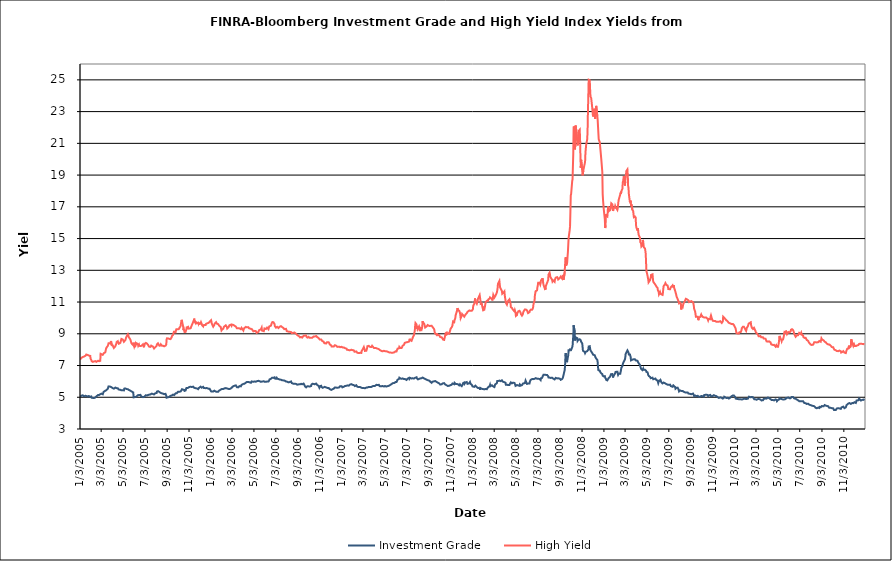
| Category | Investment Grade | High Yield |
|---|---|---|
| 1/3/05 | 5.028 | 7.369 |
| 1/4/05 | 5.061 | 7.382 |
| 1/5/05 | 5.074 | 7.452 |
| 1/6/05 | 5.093 | 7.439 |
| 1/7/05 | 5.104 | 7.456 |
| 1/10/05 | 5.126 | 7.538 |
| 1/11/05 | 5.11 | 7.556 |
| 1/12/05 | 5.098 | 7.546 |
| 1/13/05 | 5.059 | 7.556 |
| 1/14/05 | 5.074 | 7.594 |
| 1/18/05 | 5.096 | 7.617 |
| 1/19/05 | 5.083 | 7.6 |
| 1/20/05 | 5.094 | 7.692 |
| 1/21/05 | 5.073 | 7.68 |
| 1/24/05 | 5.045 | 7.664 |
| 1/25/05 | 5.062 | 7.654 |
| 1/26/05 | 5.059 | 7.637 |
| 1/27/05 | 5.078 | 7.626 |
| 1/28/05 | 5.033 | 7.615 |
| 1/31/05 | 5.028 | 7.608 |
| 2/1/05 | 5.034 | 7.427 |
| 2/2/05 | 5.038 | 7.385 |
| 2/3/05 | 5.049 | 7.352 |
| 2/4/05 | 4.972 | 7.275 |
| 2/7/05 | 4.959 | 7.23 |
| 2/8/05 | 4.946 | 7.196 |
| 2/9/05 | 4.923 | 7.215 |
| 2/10/05 | 4.948 | 7.251 |
| 2/11/05 | 4.984 | 7.29 |
| 2/14/05 | 4.982 | 7.278 |
| 2/15/05 | 4.994 | 7.24 |
| 2/16/05 | 5.031 | 7.237 |
| 2/17/05 | 5.053 | 7.232 |
| 2/18/05 | 5.105 | 7.274 |
| 2/22/05 | 5.144 | 7.302 |
| 2/23/05 | 5.127 | 7.284 |
| 2/24/05 | 5.133 | 7.273 |
| 2/25/05 | 5.145 | 7.273 |
| 2/28/05 | 5.191 | 7.296 |
| 3/1/05 | 5.227 | 7.737 |
| 3/2/05 | 5.236 | 7.751 |
| 3/3/05 | 5.229 | 7.721 |
| 3/4/05 | 5.21 | 7.702 |
| 3/7/05 | 5.186 | 7.672 |
| 3/8/05 | 5.24 | 7.648 |
| 3/9/05 | 5.331 | 7.723 |
| 3/10/05 | 5.354 | 7.781 |
| 3/11/05 | 5.376 | 7.785 |
| 3/14/05 | 5.41 | 7.828 |
| 3/15/05 | 5.408 | 7.878 |
| 3/16/05 | 5.456 | 8.046 |
| 3/17/05 | 5.447 | 8.114 |
| 3/18/05 | 5.477 | 8.084 |
| 3/21/05 | 5.533 | 8.24 |
| 3/22/05 | 5.584 | 8.309 |
| 3/23/05 | 5.683 | 8.4 |
| 3/24/05 | 5.626 | 8.362 |
| 3/28/05 | 5.67 | 8.395 |
| 3/29/05 | 5.673 | 8.451 |
| 3/30/05 | 5.664 | 8.544 |
| 3/31/05 | 5.634 | 8.558 |
| 4/1/05 | 5.578 | 8.28 |
| 4/4/05 | 5.574 | 8.27 |
| 4/5/05 | 5.574 | 8.2 |
| 4/6/05 | 5.544 | 8.139 |
| 4/7/05 | 5.544 | 8.108 |
| 4/8/05 | 5.588 | 8.132 |
| 4/11/05 | 5.612 | 8.213 |
| 4/12/05 | 5.571 | 8.236 |
| 4/13/05 | 5.554 | 8.248 |
| 4/14/05 | 5.576 | 8.393 |
| 4/15/05 | 5.586 | 8.486 |
| 4/18/05 | 5.564 | 8.535 |
| 4/19/05 | 5.514 | 8.464 |
| 4/20/05 | 5.494 | 8.418 |
| 4/21/05 | 5.485 | 8.374 |
| 4/22/05 | 5.468 | 8.392 |
| 4/25/05 | 5.469 | 8.43 |
| 4/26/05 | 5.487 | 8.505 |
| 4/27/05 | 5.463 | 8.593 |
| 4/28/05 | 5.436 | 8.676 |
| 4/29/05 | 5.436 | 8.722 |
| 5/2/05 | 5.446 | 8.635 |
| 5/3/05 | 5.441 | 8.618 |
| 5/4/05 | 5.435 | 8.583 |
| 5/5/05 | 5.433 | 8.497 |
| 5/6/05 | 5.547 | 8.559 |
| 5/9/05 | 5.558 | 8.604 |
| 5/10/05 | 5.532 | 8.681 |
| 5/11/05 | 5.515 | 8.757 |
| 5/12/05 | 5.52 | 8.8 |
| 5/13/05 | 5.508 | 8.853 |
| 5/16/05 | 5.508 | 8.966 |
| 5/17/05 | 5.511 | 9.027 |
| 5/18/05 | 5.463 | 8.921 |
| 5/19/05 | 5.456 | 8.776 |
| 5/20/05 | 5.458 | 8.729 |
| 5/23/05 | 5.414 | 8.634 |
| 5/24/05 | 5.401 | 8.618 |
| 5/25/05 | 5.379 | 8.478 |
| 5/26/05 | 5.372 | 8.401 |
| 5/27/05 | 5.349 | 8.36 |
| 5/31/05 | 5.301 | 8.283 |
| 6/1/05 | 4.996 | 8.441 |
| 6/2/05 | 4.948 | 8.3 |
| 6/3/05 | 4.961 | 8.195 |
| 6/6/05 | 5.019 | 8.372 |
| 6/7/05 | 4.971 | 8.293 |
| 6/8/05 | 4.994 | 8.334 |
| 6/9/05 | 5.048 | 8.402 |
| 6/10/05 | 5.078 | 8.425 |
| 6/13/05 | 5.128 | 8.354 |
| 6/14/05 | 5.144 | 8.244 |
| 6/15/05 | 5.15 | 8.181 |
| 6/16/05 | 5.144 | 8.323 |
| 6/17/05 | 5.118 | 8.241 |
| 6/20/05 | 5.15 | 8.229 |
| 6/21/05 | 5.113 | 8.257 |
| 6/22/05 | 5.054 | 8.269 |
| 6/23/05 | 5.055 | 8.242 |
| 6/24/05 | 5.029 | 8.268 |
| 6/27/05 | 5.006 | 8.33 |
| 6/28/05 | 5.031 | 8.263 |
| 6/29/05 | 5.039 | 8.218 |
| 6/30/05 | 5.022 | 8.15 |
| 7/1/05 | 5.04 | 8.341 |
| 7/5/05 | 5.13 | 8.426 |
| 7/6/05 | 5.118 | 8.428 |
| 7/7/05 | 5.081 | 8.459 |
| 7/8/05 | 5.109 | 8.388 |
| 7/11/05 | 5.14 | 8.313 |
| 7/12/05 | 5.145 | 8.28 |
| 7/13/05 | 5.168 | 8.276 |
| 7/14/05 | 5.16 | 8.191 |
| 7/15/05 | 5.169 | 8.186 |
| 7/18/05 | 5.18 | 8.177 |
| 7/19/05 | 5.192 | 8.206 |
| 7/20/05 | 5.195 | 8.254 |
| 7/21/05 | 5.227 | 8.224 |
| 7/22/05 | 5.208 | 8.194 |
| 7/25/05 | 5.207 | 8.19 |
| 7/26/05 | 5.216 | 8.179 |
| 7/27/05 | 5.219 | 8.13 |
| 7/28/05 | 5.177 | 8.07 |
| 7/29/05 | 5.207 | 8.069 |
| 8/1/05 | 5.259 | 8.162 |
| 8/2/05 | 5.266 | 8.164 |
| 8/3/05 | 5.266 | 8.222 |
| 8/4/05 | 5.263 | 8.234 |
| 8/5/05 | 5.355 | 8.327 |
| 8/8/05 | 5.383 | 8.398 |
| 8/9/05 | 5.395 | 8.37 |
| 8/10/05 | 5.365 | 8.317 |
| 8/11/05 | 5.349 | 8.326 |
| 8/12/05 | 5.296 | 8.249 |
| 8/15/05 | 5.282 | 8.262 |
| 8/16/05 | 5.252 | 8.332 |
| 8/17/05 | 5.268 | 8.314 |
| 8/18/05 | 5.252 | 8.296 |
| 8/19/05 | 5.247 | 8.249 |
| 8/22/05 | 5.231 | 8.243 |
| 8/23/05 | 5.211 | 8.222 |
| 8/24/05 | 5.211 | 8.209 |
| 8/25/05 | 5.194 | 8.208 |
| 8/26/05 | 5.21 | 8.195 |
| 8/29/05 | 5.215 | 8.25 |
| 8/30/05 | 5.192 | 8.268 |
| 8/31/05 | 5.105 | 8.317 |
| 9/1/05 | 4.973 | 8.637 |
| 9/2/05 | 4.97 | 8.712 |
| 9/6/05 | 5.006 | 8.707 |
| 9/7/05 | 5.052 | 8.712 |
| 9/8/05 | 5.064 | 8.731 |
| 9/9/05 | 5.042 | 8.676 |
| 9/12/05 | 5.089 | 8.664 |
| 9/13/05 | 5.056 | 8.712 |
| 9/14/05 | 5.067 | 8.719 |
| 9/15/05 | 5.106 | 8.778 |
| 9/16/05 | 5.165 | 8.855 |
| 9/19/05 | 5.167 | 8.932 |
| 9/20/05 | 5.19 | 9.028 |
| 9/21/05 | 5.136 | 9.092 |
| 9/22/05 | 5.136 | 9.181 |
| 9/23/05 | 5.177 | 9.094 |
| 9/26/05 | 5.246 | 9.09 |
| 9/27/05 | 5.26 | 9.191 |
| 9/28/05 | 5.248 | 9.278 |
| 9/29/05 | 5.248 | 9.253 |
| 9/30/05 | 5.286 | 9.23 |
| 10/3/05 | 5.347 | 9.279 |
| 10/4/05 | 5.339 | 9.245 |
| 10/5/05 | 5.326 | 9.278 |
| 10/6/05 | 5.344 | 9.32 |
| 10/7/05 | 5.364 | 9.392 |
| 10/10/05 | 5.363 | 9.476 |
| 10/11/05 | 5.386 | 9.648 |
| 10/12/05 | 5.43 | 9.768 |
| 10/13/05 | 5.492 | 9.877 |
| 10/14/05 | 5.509 | 9.795 |
| 10/17/05 | 5.479 | 9.459 |
| 10/18/05 | 5.456 | 9.226 |
| 10/19/05 | 5.446 | 9.298 |
| 10/20/05 | 5.466 | 9.271 |
| 10/21/05 | 5.402 | 9.111 |
| 10/24/05 | 5.43 | 9.119 |
| 10/25/05 | 5.485 | 9.142 |
| 10/26/05 | 5.578 | 9.281 |
| 10/27/05 | 5.586 | 9.406 |
| 10/28/05 | 5.588 | 9.441 |
| 10/31/05 | 5.593 | 9.437 |
| 11/1/05 | 5.581 | 9.325 |
| 11/2/05 | 5.614 | 9.326 |
| 11/3/05 | 5.646 | 9.278 |
| 11/4/05 | 5.663 | 9.328 |
| 11/7/05 | 5.665 | 9.351 |
| 11/8/05 | 5.604 | 9.392 |
| 11/9/05 | 5.656 | 9.469 |
| 11/10/05 | 5.643 | 9.492 |
| 11/11/05 | 5.622 | 9.436 |
| 11/14/05 | 5.671 | 9.741 |
| 11/15/05 | 5.652 | 9.76 |
| 11/16/05 | 5.61 | 9.857 |
| 11/17/05 | 5.593 | 9.956 |
| 11/18/05 | 5.6 | 9.759 |
| 11/21/05 | 5.571 | 9.665 |
| 11/22/05 | 5.562 | 9.733 |
| 11/23/05 | 5.564 | 9.738 |
| 11/25/05 | 5.552 | 9.674 |
| 11/28/05 | 5.512 | 9.702 |
| 11/29/05 | 5.547 | 9.63 |
| 11/30/05 | 5.584 | 9.697 |
| 12/1/05 | 5.613 | 9.578 |
| 12/2/05 | 5.634 | 9.648 |
| 12/5/05 | 5.671 | 9.662 |
| 12/6/05 | 5.641 | 9.727 |
| 12/7/05 | 5.647 | 9.687 |
| 12/8/05 | 5.604 | 9.613 |
| 12/9/05 | 5.631 | 9.538 |
| 12/12/05 | 5.657 | 9.464 |
| 12/13/05 | 5.646 | 9.544 |
| 12/14/05 | 5.583 | 9.532 |
| 12/15/05 | 5.598 | 9.566 |
| 12/16/05 | 5.561 | 9.557 |
| 12/19/05 | 5.574 | 9.559 |
| 12/20/05 | 5.592 | 9.628 |
| 12/21/05 | 5.62 | 9.647 |
| 12/22/05 | 5.58 | 9.676 |
| 12/23/05 | 5.558 | 9.656 |
| 12/27/05 | 5.536 | 9.688 |
| 12/28/05 | 5.519 | 9.673 |
| 12/29/05 | 5.528 | 9.711 |
| 12/30/05 | 5.533 | 9.756 |
| 1/3/06 | 5.37 | 9.856 |
| 1/4/06 | 5.346 | 9.771 |
| 1/5/06 | 5.347 | 9.638 |
| 1/6/06 | 5.364 | 9.614 |
| 1/9/06 | 5.366 | 9.449 |
| 1/10/06 | 5.403 | 9.488 |
| 1/11/06 | 5.427 | 9.49 |
| 1/12/06 | 5.415 | 9.555 |
| 1/13/06 | 5.368 | 9.637 |
| 1/17/06 | 5.349 | 9.73 |
| 1/18/06 | 5.333 | 9.725 |
| 1/19/06 | 5.356 | 9.641 |
| 1/20/06 | 5.355 | 9.681 |
| 1/23/06 | 5.348 | 9.607 |
| 1/24/06 | 5.36 | 9.557 |
| 1/25/06 | 5.412 | 9.525 |
| 1/26/06 | 5.47 | 9.571 |
| 1/27/06 | 5.463 | 9.557 |
| 1/30/06 | 5.482 | 9.42 |
| 1/31/06 | 5.478 | 9.399 |
| 2/1/06 | 5.524 | 9.213 |
| 2/2/06 | 5.524 | 9.226 |
| 2/3/06 | 5.537 | 9.277 |
| 2/6/06 | 5.518 | 9.318 |
| 2/7/06 | 5.536 | 9.372 |
| 2/8/06 | 5.555 | 9.442 |
| 2/9/06 | 5.559 | 9.443 |
| 2/10/06 | 5.553 | 9.463 |
| 2/13/06 | 5.577 | 9.534 |
| 2/14/06 | 5.594 | 9.563 |
| 2/15/06 | 5.583 | 9.494 |
| 2/16/06 | 5.56 | 9.431 |
| 2/17/06 | 5.507 | 9.335 |
| 2/21/06 | 5.523 | 9.425 |
| 2/22/06 | 5.512 | 9.486 |
| 2/23/06 | 5.521 | 9.531 |
| 2/24/06 | 5.525 | 9.555 |
| 2/27/06 | 5.552 | 9.574 |
| 2/28/06 | 5.526 | 9.54 |
| 3/1/06 | 5.569 | 9.505 |
| 3/2/06 | 5.615 | 9.582 |
| 3/3/06 | 5.656 | 9.641 |
| 3/6/06 | 5.701 | 9.557 |
| 3/7/06 | 5.732 | 9.578 |
| 3/8/06 | 5.727 | 9.577 |
| 3/9/06 | 5.724 | 9.516 |
| 3/10/06 | 5.747 | 9.492 |
| 3/13/06 | 5.749 | 9.452 |
| 3/14/06 | 5.695 | 9.44 |
| 3/15/06 | 5.703 | 9.39 |
| 3/16/06 | 5.636 | 9.351 |
| 3/17/06 | 5.641 | 9.404 |
| 3/20/06 | 5.625 | 9.354 |
| 3/21/06 | 5.676 | 9.3 |
| 3/22/06 | 5.68 | 9.303 |
| 3/23/06 | 5.703 | 9.341 |
| 3/24/06 | 5.675 | 9.31 |
| 3/27/06 | 5.689 | 9.288 |
| 3/28/06 | 5.736 | 9.321 |
| 3/29/06 | 5.783 | 9.372 |
| 3/30/06 | 5.828 | 9.364 |
| 3/31/06 | 5.827 | 9.319 |
| 4/3/06 | 5.842 | 9.208 |
| 4/4/06 | 5.831 | 9.287 |
| 4/5/06 | 5.812 | 9.296 |
| 4/6/06 | 5.852 | 9.369 |
| 4/7/06 | 5.9 | 9.406 |
| 4/10/06 | 5.922 | 9.432 |
| 4/11/06 | 5.897 | 9.393 |
| 4/12/06 | 5.909 | 9.392 |
| 4/13/06 | 5.965 | 9.404 |
| 4/17/06 | 5.96 | 9.416 |
| 4/18/06 | 5.922 | 9.364 |
| 4/19/06 | 5.943 | 9.346 |
| 4/20/06 | 5.945 | 9.291 |
| 4/21/06 | 5.935 | 9.306 |
| 4/24/06 | 5.914 | 9.313 |
| 4/25/06 | 5.963 | 9.331 |
| 4/26/06 | 5.999 | 9.329 |
| 4/27/06 | 5.974 | 9.287 |
| 4/28/06 | 5.955 | 9.246 |
| 5/1/06 | 5.972 | 9.152 |
| 5/2/06 | 5.958 | 9.119 |
| 5/3/06 | 5.985 | 9.146 |
| 5/4/06 | 5.996 | 9.184 |
| 5/5/06 | 5.969 | 9.178 |
| 5/8/06 | 5.978 | 9.166 |
| 5/9/06 | 5.988 | 9.132 |
| 5/10/06 | 5.97 | 9.058 |
| 5/11/06 | 6.014 | 9.035 |
| 5/12/06 | 6.049 | 9.078 |
| 5/15/06 | 6.036 | 9.116 |
| 5/16/06 | 6.014 | 9.13 |
| 5/17/06 | 6.063 | 9.23 |
| 5/18/06 | 6.014 | 9.249 |
| 5/19/06 | 5.981 | 9.221 |
| 5/22/06 | 5.972 | 9.28 |
| 5/23/06 | 6.001 | 9.254 |
| 5/24/06 | 5.978 | 9.382 |
| 5/25/06 | 5.99 | 9.204 |
| 5/26/06 | 5.975 | 9.147 |
| 5/30/06 | 6.007 | 9.164 |
| 5/31/06 | 6.04 | 9.173 |
| 6/1/06 | 6.065 | 9.338 |
| 6/2/06 | 5.97 | 9.287 |
| 6/5/06 | 5.976 | 9.3 |
| 6/6/06 | 5.995 | 9.357 |
| 6/7/06 | 6.004 | 9.326 |
| 6/8/06 | 5.989 | 9.388 |
| 6/9/06 | 5.981 | 9.338 |
| 6/12/06 | 5.99 | 9.284 |
| 6/13/06 | 5.989 | 9.364 |
| 6/14/06 | 6.061 | 9.459 |
| 6/15/06 | 6.127 | 9.506 |
| 6/16/06 | 6.128 | 9.518 |
| 6/19/06 | 6.165 | 9.515 |
| 6/20/06 | 6.182 | 9.557 |
| 6/21/06 | 6.196 | 9.663 |
| 6/22/06 | 6.234 | 9.674 |
| 6/23/06 | 6.265 | 9.736 |
| 6/26/06 | 6.219 | 9.726 |
| 6/27/06 | 6.261 | 9.743 |
| 6/28/06 | 6.279 | 9.73 |
| 6/29/06 | 6.255 | 9.614 |
| 6/30/06 | 6.187 | 9.472 |
| 7/3/06 | 6.165 | 9.386 |
| 7/5/06 | 6.233 | 9.427 |
| 7/6/06 | 6.21 | 9.438 |
| 7/7/06 | 6.165 | 9.378 |
| 7/10/06 | 6.15 | 9.363 |
| 7/11/06 | 6.124 | 9.363 |
| 7/12/06 | 6.141 | 9.368 |
| 7/13/06 | 6.119 | 9.443 |
| 7/14/06 | 6.101 | 9.475 |
| 7/17/06 | 6.107 | 9.481 |
| 7/18/06 | 6.151 | 9.474 |
| 7/19/06 | 6.108 | 9.444 |
| 7/20/06 | 6.069 | 9.425 |
| 7/21/06 | 6.048 | 9.367 |
| 7/24/06 | 6.063 | 9.361 |
| 7/25/06 | 6.089 | 9.348 |
| 7/26/06 | 6.072 | 9.292 |
| 7/27/06 | 6.049 | 9.281 |
| 7/28/06 | 5.999 | 9.315 |
| 7/31/06 | 5.991 | 9.31 |
| 8/1/06 | 6.007 | 9.243 |
| 8/2/06 | 5.986 | 9.166 |
| 8/3/06 | 5.985 | 9.192 |
| 8/4/06 | 5.934 | 9.121 |
| 8/7/06 | 5.939 | 9.134 |
| 8/8/06 | 5.944 | 9.097 |
| 8/9/06 | 5.954 | 9.077 |
| 8/10/06 | 5.957 | 9.127 |
| 8/11/06 | 5.974 | 9.118 |
| 8/14/06 | 5.997 | 9.109 |
| 8/15/06 | 5.948 | 9.086 |
| 8/16/06 | 5.892 | 9.039 |
| 8/17/06 | 5.88 | 9.012 |
| 8/18/06 | 5.87 | 9.026 |
| 8/21/06 | 5.85 | 9.072 |
| 8/22/06 | 5.848 | 9.081 |
| 8/23/06 | 5.858 | 9.076 |
| 8/24/06 | 5.849 | 9.074 |
| 8/25/06 | 5.827 | 9.032 |
| 8/28/06 | 5.842 | 8.995 |
| 8/29/06 | 5.861 | 9.003 |
| 8/30/06 | 5.82 | 8.966 |
| 8/31/06 | 5.792 | 8.924 |
| 9/1/06 | 5.799 | 8.891 |
| 9/5/06 | 5.815 | 8.85 |
| 9/6/06 | 5.856 | 8.835 |
| 9/7/06 | 5.846 | 8.808 |
| 9/8/06 | 5.815 | 8.776 |
| 9/11/06 | 5.847 | 8.803 |
| 9/12/06 | 5.836 | 8.768 |
| 9/13/06 | 5.798 | 8.757 |
| 9/14/06 | 5.817 | 8.76 |
| 9/15/06 | 5.83 | 8.812 |
| 9/18/06 | 5.863 | 8.874 |
| 9/19/06 | 5.809 | 8.859 |
| 9/20/06 | 5.782 | 8.855 |
| 9/21/06 | 5.736 | 8.884 |
| 9/22/06 | 5.683 | 8.875 |
| 9/25/06 | 5.625 | 8.886 |
| 9/26/06 | 5.648 | 8.815 |
| 9/27/06 | 5.66 | 8.773 |
| 9/28/06 | 5.688 | 8.788 |
| 9/29/06 | 5.695 | 8.758 |
| 10/2/06 | 5.688 | 8.808 |
| 10/3/06 | 5.688 | 8.83 |
| 10/4/06 | 5.653 | 8.763 |
| 10/5/06 | 5.676 | 8.745 |
| 10/6/06 | 5.731 | 8.759 |
| 10/9/06 | 5.706 | 8.746 |
| 10/10/06 | 5.802 | 8.778 |
| 10/11/06 | 5.816 | 8.762 |
| 10/12/06 | 5.822 | 8.747 |
| 10/13/06 | 5.853 | 8.745 |
| 10/16/06 | 5.838 | 8.829 |
| 10/17/06 | 5.801 | 8.82 |
| 10/18/06 | 5.807 | 8.82 |
| 10/19/06 | 5.82 | 8.829 |
| 10/20/06 | 5.833 | 8.85 |
| 10/23/06 | 5.863 | 8.858 |
| 10/24/06 | 5.863 | 8.831 |
| 10/25/06 | 5.835 | 8.83 |
| 10/26/06 | 5.776 | 8.791 |
| 10/27/06 | 5.725 | 8.729 |
| 10/30/06 | 5.709 | 8.727 |
| 10/31/06 | 5.666 | 8.711 |
| 11/1/06 | 5.601 | 8.672 |
| 11/2/06 | 5.614 | 8.638 |
| 11/3/06 | 5.703 | 8.649 |
| 11/6/06 | 5.723 | 8.643 |
| 11/7/06 | 5.651 | 8.589 |
| 11/8/06 | 5.654 | 8.592 |
| 11/9/06 | 5.632 | 8.545 |
| 11/10/06 | 5.598 | 8.504 |
| 11/13/06 | 5.625 | 8.499 |
| 11/14/06 | 5.593 | 8.444 |
| 11/15/06 | 5.626 | 8.408 |
| 11/16/06 | 5.655 | 8.384 |
| 11/17/06 | 5.624 | 8.384 |
| 11/20/06 | 5.618 | 8.39 |
| 11/21/06 | 5.606 | 8.44 |
| 11/22/06 | 5.58 | 8.465 |
| 11/24/06 | 5.581 | 8.464 |
| 11/27/06 | 5.583 | 8.464 |
| 11/28/06 | 5.543 | 8.465 |
| 11/29/06 | 5.535 | 8.392 |
| 11/30/06 | 5.509 | 8.324 |
| 12/1/06 | 5.472 | 8.29 |
| 12/4/06 | 5.465 | 8.27 |
| 12/5/06 | 5.454 | 8.202 |
| 12/6/06 | 5.48 | 8.171 |
| 12/7/06 | 5.495 | 8.169 |
| 12/8/06 | 5.532 | 8.204 |
| 12/11/06 | 5.544 | 8.194 |
| 12/12/06 | 5.527 | 8.191 |
| 12/13/06 | 5.579 | 8.245 |
| 12/14/06 | 5.612 | 8.28 |
| 12/15/06 | 5.588 | 8.218 |
| 12/18/06 | 5.608 | 8.247 |
| 12/19/06 | 5.604 | 8.217 |
| 12/20/06 | 5.61 | 8.201 |
| 12/21/06 | 5.596 | 8.174 |
| 12/22/06 | 5.613 | 8.176 |
| 12/26/06 | 5.62 | 8.191 |
| 12/27/06 | 5.65 | 8.147 |
| 12/28/06 | 5.679 | 8.143 |
| 12/29/06 | 5.7 | 8.157 |
| 1/2/07 | 5.694 | 8.178 |
| 1/3/07 | 5.669 | 8.143 |
| 1/4/07 | 5.624 | 8.142 |
| 1/5/07 | 5.653 | 8.14 |
| 1/8/07 | 5.658 | 8.143 |
| 1/9/07 | 5.656 | 8.117 |
| 1/10/07 | 5.678 | 8.098 |
| 1/11/07 | 5.706 | 8.098 |
| 1/12/07 | 5.75 | 8.084 |
| 1/16/07 | 5.727 | 8.058 |
| 1/17/07 | 5.733 | 7.994 |
| 1/18/07 | 5.744 | 8.013 |
| 1/19/07 | 5.75 | 8.025 |
| 1/22/07 | 5.732 | 7.974 |
| 1/23/07 | 5.749 | 7.947 |
| 1/24/07 | 5.758 | 7.928 |
| 1/25/07 | 5.794 | 7.954 |
| 1/26/07 | 5.823 | 7.992 |
| 1/29/07 | 5.826 | 7.995 |
| 1/30/07 | 5.829 | 8.042 |
| 1/31/07 | 5.807 | 8.054 |
| 2/1/07 | 5.788 | 7.972 |
| 2/2/07 | 5.78 | 7.946 |
| 2/5/07 | 5.766 | 7.955 |
| 2/6/07 | 5.746 | 7.926 |
| 2/7/07 | 5.703 | 7.866 |
| 2/8/07 | 5.705 | 7.855 |
| 2/9/07 | 5.735 | 7.858 |
| 2/12/07 | 5.758 | 7.888 |
| 2/13/07 | 5.773 | 7.892 |
| 2/14/07 | 5.715 | 7.85 |
| 2/15/07 | 5.658 | 7.8 |
| 2/16/07 | 5.643 | 7.796 |
| 2/20/07 | 5.639 | 7.788 |
| 2/21/07 | 5.645 | 7.764 |
| 2/22/07 | 5.67 | 7.757 |
| 2/23/07 | 5.641 | 7.8 |
| 2/26/07 | 5.607 | 7.792 |
| 2/27/07 | 5.569 | 7.918 |
| 2/28/07 | 5.571 | 7.912 |
| 3/1/07 | 5.577 | 7.98 |
| 3/2/07 | 5.571 | 8.029 |
| 3/5/07 | 5.586 | 8.164 |
| 3/6/07 | 5.597 | 8.127 |
| 3/7/07 | 5.582 | 8.018 |
| 3/8/07 | 5.566 | 7.921 |
| 3/9/07 | 5.625 | 7.916 |
| 3/12/07 | 5.608 | 7.932 |
| 3/13/07 | 5.585 | 8.002 |
| 3/14/07 | 5.607 | 8.097 |
| 3/15/07 | 5.613 | 8.22 |
| 3/16/07 | 5.624 | 8.236 |
| 3/19/07 | 5.653 | 8.242 |
| 3/20/07 | 5.645 | 8.25 |
| 3/21/07 | 5.641 | 8.216 |
| 3/22/07 | 5.642 | 8.175 |
| 3/23/07 | 5.655 | 8.154 |
| 3/26/07 | 5.648 | 8.172 |
| 3/27/07 | 5.668 | 8.198 |
| 3/28/07 | 5.665 | 8.244 |
| 3/29/07 | 5.697 | 8.238 |
| 3/30/07 | 5.713 | 8.246 |
| 4/2/07 | 5.71 | 8.108 |
| 4/3/07 | 5.724 | 8.106 |
| 4/4/07 | 5.716 | 8.125 |
| 4/5/07 | 5.716 | 8.1 |
| 4/9/07 | 5.783 | 8.095 |
| 4/10/07 | 5.763 | 8.099 |
| 4/11/07 | 5.754 | 8.062 |
| 4/12/07 | 5.767 | 8.061 |
| 4/13/07 | 5.792 | 8.056 |
| 4/16/07 | 5.783 | 8.033 |
| 4/17/07 | 5.737 | 8.005 |
| 4/18/07 | 5.701 | 7.993 |
| 4/19/07 | 5.698 | 7.97 |
| 4/20/07 | 5.703 | 7.934 |
| 4/23/07 | 5.687 | 7.92 |
| 4/24/07 | 5.66 | 7.913 |
| 4/25/07 | 5.681 | 7.923 |
| 4/26/07 | 5.712 | 7.897 |
| 4/27/07 | 5.731 | 7.911 |
| 4/30/07 | 5.677 | 7.928 |
| 5/1/07 | 5.689 | 7.95 |
| 5/2/07 | 5.687 | 7.92 |
| 5/3/07 | 5.707 | 7.904 |
| 5/4/07 | 5.679 | 7.904 |
| 5/7/07 | 5.677 | 7.895 |
| 5/8/07 | 5.672 | 7.88 |
| 5/9/07 | 5.692 | 7.879 |
| 5/10/07 | 5.699 | 7.876 |
| 5/11/07 | 5.698 | 7.864 |
| 5/14/07 | 5.724 | 7.829 |
| 5/15/07 | 5.728 | 7.808 |
| 5/16/07 | 5.736 | 7.825 |
| 5/17/07 | 5.769 | 7.819 |
| 5/18/07 | 5.799 | 7.815 |
| 5/21/07 | 5.822 | 7.81 |
| 5/22/07 | 5.837 | 7.814 |
| 5/23/07 | 5.874 | 7.788 |
| 5/24/07 | 5.887 | 7.805 |
| 5/25/07 | 5.87 | 7.815 |
| 5/29/07 | 5.897 | 7.833 |
| 5/30/07 | 5.905 | 7.862 |
| 5/31/07 | 5.934 | 7.864 |
| 6/1/07 | 5.958 | 7.893 |
| 6/4/07 | 5.958 | 7.884 |
| 6/5/07 | 5.992 | 7.912 |
| 6/6/07 | 6.005 | 7.943 |
| 6/7/07 | 6.106 | 8.063 |
| 6/8/07 | 6.16 | 8.113 |
| 6/11/07 | 6.156 | 8.089 |
| 6/12/07 | 6.233 | 8.177 |
| 6/13/07 | 6.237 | 8.191 |
| 6/14/07 | 6.22 | 8.186 |
| 6/15/07 | 6.185 | 8.1 |
| 6/18/07 | 6.162 | 8.098 |
| 6/19/07 | 6.123 | 8.117 |
| 6/20/07 | 6.146 | 8.17 |
| 6/21/07 | 6.186 | 8.242 |
| 6/22/07 | 6.193 | 8.239 |
| 6/25/07 | 6.145 | 8.307 |
| 6/26/07 | 6.15 | 8.336 |
| 6/27/07 | 6.134 | 8.429 |
| 6/28/07 | 6.145 | 8.391 |
| 6/29/07 | 6.113 | 8.392 |
| 7/2/07 | 6.089 | 8.464 |
| 7/3/07 | 6.08 | 8.443 |
| 7/5/07 | 6.172 | 8.477 |
| 7/6/07 | 6.223 | 8.481 |
| 7/9/07 | 6.221 | 8.509 |
| 7/10/07 | 6.157 | 8.589 |
| 7/11/07 | 6.173 | 8.686 |
| 7/12/07 | 6.222 | 8.606 |
| 7/13/07 | 6.214 | 8.561 |
| 7/16/07 | 6.182 | 8.554 |
| 7/17/07 | 6.188 | 8.574 |
| 7/18/07 | 6.18 | 8.665 |
| 7/19/07 | 6.198 | 8.672 |
| 7/20/07 | 6.152 | 8.798 |
| 7/23/07 | 6.178 | 8.934 |
| 7/24/07 | 6.186 | 9.095 |
| 7/25/07 | 6.187 | 9.169 |
| 7/26/07 | 6.226 | 9.485 |
| 7/27/07 | 6.239 | 9.676 |
| 7/30/07 | 6.261 | 9.587 |
| 7/31/07 | 6.193 | 9.318 |
| 8/1/07 | 6.164 | 9.47 |
| 8/2/07 | 6.154 | 9.299 |
| 8/3/07 | 6.125 | 9.358 |
| 8/6/07 | 6.158 | 9.467 |
| 8/7/07 | 6.16 | 9.379 |
| 8/8/07 | 6.206 | 9.167 |
| 8/9/07 | 6.185 | 9.218 |
| 8/10/07 | 6.216 | 9.341 |
| 8/13/07 | 6.198 | 9.262 |
| 8/14/07 | 6.187 | 9.333 |
| 8/15/07 | 6.217 | 9.49 |
| 8/16/07 | 6.242 | 9.796 |
| 8/17/07 | 6.22 | 9.66 |
| 8/20/07 | 6.187 | 9.647 |
| 8/21/07 | 6.158 | 9.653 |
| 8/22/07 | 6.178 | 9.492 |
| 8/23/07 | 6.151 | 9.397 |
| 8/24/07 | 6.141 | 9.423 |
| 8/27/07 | 6.106 | 9.464 |
| 8/28/07 | 6.087 | 9.504 |
| 8/29/07 | 6.093 | 9.502 |
| 8/30/07 | 6.079 | 9.551 |
| 8/31/07 | 6.067 | 9.517 |
| 9/4/07 | 6.038 | 9.487 |
| 9/5/07 | 5.999 | 9.475 |
| 9/6/07 | 6.02 | 9.458 |
| 9/7/07 | 5.964 | 9.499 |
| 9/10/07 | 5.912 | 9.508 |
| 9/11/07 | 5.94 | 9.53 |
| 9/12/07 | 5.977 | 9.506 |
| 9/13/07 | 6.029 | 9.418 |
| 9/14/07 | 6.013 | 9.387 |
| 9/17/07 | 6.004 | 9.296 |
| 9/18/07 | 5.991 | 9.174 |
| 9/19/07 | 5.958 | 9.05 |
| 9/20/07 | 6.023 | 9.096 |
| 9/21/07 | 5.994 | 9.005 |
| 9/24/07 | 5.967 | 8.938 |
| 9/25/07 | 5.95 | 9.046 |
| 9/26/07 | 5.973 | 8.93 |
| 9/27/07 | 5.921 | 8.911 |
| 9/28/07 | 5.896 | 8.957 |
| 10/1/07 | 5.878 | 8.912 |
| 10/2/07 | 5.841 | 8.88 |
| 10/3/07 | 5.84 | 8.863 |
| 10/4/07 | 5.799 | 8.793 |
| 10/5/07 | 5.837 | 8.783 |
| 10/8/07 | 5.821 | 8.781 |
| 10/9/07 | 5.859 | 8.748 |
| 10/10/07 | 5.862 | 8.711 |
| 10/11/07 | 5.874 | 8.654 |
| 10/12/07 | 5.877 | 8.631 |
| 10/15/07 | 5.889 | 8.616 |
| 10/16/07 | 5.872 | 8.722 |
| 10/17/07 | 5.838 | 8.814 |
| 10/18/07 | 5.802 | 8.921 |
| 10/19/07 | 5.743 | 9.037 |
| 10/22/07 | 5.755 | 9.078 |
| 10/23/07 | 5.751 | 8.973 |
| 10/24/07 | 5.701 | 9.028 |
| 10/25/07 | 5.709 | 9.001 |
| 10/26/07 | 5.728 | 9.031 |
| 10/29/07 | 5.726 | 9.007 |
| 10/30/07 | 5.726 | 9.062 |
| 10/31/07 | 5.776 | 9.004 |
| 11/1/07 | 5.758 | 9.237 |
| 11/2/07 | 5.751 | 9.32 |
| 11/5/07 | 5.792 | 9.411 |
| 11/6/07 | 5.833 | 9.368 |
| 11/7/07 | 5.866 | 9.513 |
| 11/8/07 | 5.885 | 9.672 |
| 11/9/07 | 5.863 | 9.779 |
| 11/12/07 | 5.822 | 9.736 |
| 11/13/07 | 5.906 | 9.867 |
| 11/14/07 | 5.898 | 9.823 |
| 11/15/07 | 5.854 | 9.982 |
| 11/16/07 | 5.84 | 10.166 |
| 11/19/07 | 5.84 | 10.392 |
| 11/20/07 | 5.841 | 10.474 |
| 11/21/07 | 5.811 | 10.62 |
| 11/23/07 | 5.81 | 10.463 |
| 11/26/07 | 5.75 | 10.457 |
| 11/27/07 | 5.776 | 10.52 |
| 11/28/07 | 5.819 | 10.312 |
| 11/29/07 | 5.775 | 10.186 |
| 11/30/07 | 5.754 | 9.984 |
| 12/3/07 | 5.701 | 10.132 |
| 12/4/07 | 5.734 | 10.244 |
| 12/5/07 | 5.773 | 10.227 |
| 12/6/07 | 5.829 | 10.251 |
| 12/7/07 | 5.898 | 10.162 |
| 12/10/07 | 5.93 | 10.078 |
| 12/11/07 | 5.857 | 10.069 |
| 12/12/07 | 5.888 | 10.088 |
| 12/13/07 | 5.934 | 10.194 |
| 12/14/07 | 5.979 | 10.223 |
| 12/17/07 | 5.96 | 10.298 |
| 12/18/07 | 5.898 | 10.302 |
| 12/19/07 | 5.844 | 10.377 |
| 12/20/07 | 5.788 | 10.374 |
| 12/21/07 | 5.864 | 10.385 |
| 12/24/07 | 5.886 | 10.471 |
| 12/26/07 | 5.962 | 10.455 |
| 12/27/07 | 5.926 | 10.444 |
| 12/28/07 | 5.834 | 10.474 |
| 12/31/07 | 5.79 | 10.446 |
| 1/2/08 | 5.682 | 10.456 |
| 1/3/08 | 5.677 | 10.543 |
| 1/4/08 | 5.638 | 10.76 |
| 1/7/08 | 5.654 | 10.9 |
| 1/8/08 | 5.679 | 10.99 |
| 1/9/08 | 5.699 | 11.229 |
| 1/10/08 | 5.729 | 11.108 |
| 1/11/08 | 5.666 | 11.017 |
| 1/14/08 | 5.64 | 10.892 |
| 1/15/08 | 5.603 | 10.937 |
| 1/16/08 | 5.601 | 11.039 |
| 1/17/08 | 5.587 | 11.186 |
| 1/18/08 | 5.607 | 11.155 |
| 1/22/08 | 5.569 | 11.438 |
| 1/23/08 | 5.462 | 11.428 |
| 1/24/08 | 5.586 | 11.128 |
| 1/25/08 | 5.557 | 10.884 |
| 1/28/08 | 5.532 | 10.904 |
| 1/29/08 | 5.564 | 10.746 |
| 1/30/08 | 5.579 | 10.657 |
| 1/31/08 | 5.521 | 10.722 |
| 2/1/08 | 5.468 | 10.484 |
| 2/4/08 | 5.499 | 10.513 |
| 2/5/08 | 5.446 | 10.641 |
| 2/6/08 | 5.46 | 10.755 |
| 2/7/08 | 5.522 | 10.9 |
| 2/8/08 | 5.532 | 11.007 |
| 2/11/08 | 5.511 | 11.076 |
| 2/12/08 | 5.551 | 11.138 |
| 2/13/08 | 5.566 | 11.088 |
| 2/14/08 | 5.619 | 11.068 |
| 2/15/08 | 5.624 | 11.164 |
| 2/19/08 | 5.713 | 11.222 |
| 2/20/08 | 5.785 | 11.29 |
| 2/21/08 | 5.698 | 11.251 |
| 2/22/08 | 5.664 | 11.27 |
| 2/25/08 | 5.756 | 11.2 |
| 2/26/08 | 5.775 | 11.103 |
| 2/27/08 | 5.745 | 11.126 |
| 2/28/08 | 5.692 | 11.284 |
| 2/29/08 | 5.638 | 11.446 |
| 3/3/08 | 5.646 | 11.282 |
| 3/4/08 | 5.715 | 11.31 |
| 3/5/08 | 5.804 | 11.28 |
| 3/6/08 | 5.861 | 11.396 |
| 3/7/08 | 5.866 | 11.453 |
| 3/10/08 | 5.889 | 11.605 |
| 3/11/08 | 6.023 | 11.726 |
| 3/12/08 | 5.973 | 11.874 |
| 3/13/08 | 5.998 | 12.147 |
| 3/14/08 | 6.023 | 12.132 |
| 3/17/08 | 6.052 | 12.325 |
| 3/18/08 | 6.063 | 12.108 |
| 3/19/08 | 6.036 | 11.924 |
| 3/20/08 | 6.014 | 11.937 |
| 3/24/08 | 6.067 | 11.697 |
| 3/25/08 | 6.012 | 11.521 |
| 3/26/08 | 5.993 | 11.496 |
| 3/27/08 | 6.015 | 11.5 |
| 3/28/08 | 5.969 | 11.583 |
| 3/31/08 | 5.947 | 11.67 |
| 4/1/08 | 5.945 | 11.418 |
| 4/2/08 | 5.963 | 11.262 |
| 4/3/08 | 5.917 | 11.132 |
| 4/4/08 | 5.788 | 10.952 |
| 4/7/08 | 5.795 | 10.835 |
| 4/8/08 | 5.79 | 10.898 |
| 4/9/08 | 5.756 | 10.998 |
| 4/10/08 | 5.768 | 11.066 |
| 4/11/08 | 5.749 | 11.118 |
| 4/14/08 | 5.772 | 11.169 |
| 4/15/08 | 5.824 | 11.144 |
| 4/16/08 | 5.868 | 11.006 |
| 4/17/08 | 5.922 | 10.932 |
| 4/18/08 | 5.941 | 10.677 |
| 4/21/08 | 5.875 | 10.63 |
| 4/22/08 | 5.846 | 10.583 |
| 4/23/08 | 5.852 | 10.541 |
| 4/24/08 | 5.92 | 10.528 |
| 4/25/08 | 5.931 | 10.501 |
| 4/28/08 | 5.9 | 10.412 |
| 4/29/08 | 5.844 | 10.491 |
| 4/30/08 | 5.801 | 10.432 |
| 5/1/08 | 5.718 | 10.337 |
| 5/2/08 | 5.757 | 10.126 |
| 5/5/08 | 5.77 | 10.178 |
| 5/6/08 | 5.781 | 10.301 |
| 5/7/08 | 5.804 | 10.326 |
| 5/8/08 | 5.749 | 10.352 |
| 5/9/08 | 5.703 | 10.424 |
| 5/12/08 | 5.719 | 10.447 |
| 5/13/08 | 5.808 | 10.437 |
| 5/14/08 | 5.85 | 10.409 |
| 5/15/08 | 5.815 | 10.342 |
| 5/16/08 | 5.737 | 10.244 |
| 5/19/08 | 5.764 | 10.144 |
| 5/20/08 | 5.739 | 10.171 |
| 5/21/08 | 5.758 | 10.211 |
| 5/22/08 | 5.867 | 10.302 |
| 5/23/08 | 5.828 | 10.387 |
| 5/27/08 | 5.891 | 10.535 |
| 5/28/08 | 5.966 | 10.526 |
| 5/29/08 | 6.053 | 10.507 |
| 5/30/08 | 5.992 | 10.524 |
| 6/2/08 | 5.842 | 10.474 |
| 6/3/08 | 5.831 | 10.511 |
| 6/4/08 | 5.798 | 10.514 |
| 6/5/08 | 5.862 | 10.305 |
| 6/6/08 | 5.804 | 10.32 |
| 6/9/08 | 5.87 | 10.366 |
| 6/10/08 | 5.983 | 10.456 |
| 6/11/08 | 5.999 | 10.488 |
| 6/12/08 | 6.091 | 10.504 |
| 6/13/08 | 6.112 | 10.523 |
| 6/16/08 | 6.147 | 10.512 |
| 6/17/08 | 6.12 | 10.494 |
| 6/18/08 | 6.088 | 10.582 |
| 6/19/08 | 6.142 | 10.666 |
| 6/20/08 | 6.132 | 10.862 |
| 6/23/08 | 6.161 | 11.082 |
| 6/24/08 | 6.181 | 11.417 |
| 6/25/08 | 6.202 | 11.44 |
| 6/26/08 | 6.204 | 11.681 |
| 6/27/08 | 6.163 | 11.733 |
| 6/30/08 | 6.172 | 11.736 |
| 7/1/08 | 6.171 | 11.93 |
| 7/2/08 | 6.161 | 12.027 |
| 7/3/08 | 6.163 | 12.214 |
| 7/7/08 | 6.156 | 12.226 |
| 7/8/08 | 6.136 | 12.286 |
| 7/9/08 | 6.105 | 12.104 |
| 7/10/08 | 6.08 | 12.194 |
| 7/11/08 | 6.195 | 12.368 |
| 7/14/08 | 6.219 | 12.381 |
| 7/15/08 | 6.255 | 12.509 |
| 7/16/08 | 6.337 | 12.453 |
| 7/17/08 | 6.378 | 12.231 |
| 7/18/08 | 6.42 | 12.086 |
| 7/21/08 | 6.422 | 11.896 |
| 7/22/08 | 6.461 | 11.963 |
| 7/23/08 | 6.481 | 11.788 |
| 7/24/08 | 6.411 | 11.911 |
| 7/25/08 | 6.423 | 12.045 |
| 7/28/08 | 6.406 | 12.206 |
| 7/29/08 | 6.443 | 12.271 |
| 7/30/08 | 6.426 | 12.262 |
| 7/31/08 | 6.323 | 12.392 |
| 8/1/08 | 6.242 | 12.735 |
| 8/4/08 | 6.239 | 12.852 |
| 8/5/08 | 6.254 | 12.75 |
| 8/6/08 | 6.286 | 12.59 |
| 8/7/08 | 6.218 | 12.539 |
| 8/8/08 | 6.19 | 12.592 |
| 8/11/08 | 6.231 | 12.398 |
| 8/12/08 | 6.188 | 12.295 |
| 8/13/08 | 6.208 | 12.336 |
| 8/14/08 | 6.175 | 12.362 |
| 8/15/08 | 6.144 | 12.309 |
| 8/18/08 | 6.126 | 12.273 |
| 8/19/08 | 6.164 | 12.422 |
| 8/20/08 | 6.163 | 12.469 |
| 8/21/08 | 6.223 | 12.535 |
| 8/22/08 | 6.223 | 12.49 |
| 8/25/08 | 6.186 | 12.569 |
| 8/26/08 | 6.205 | 12.558 |
| 8/27/08 | 6.206 | 12.504 |
| 8/28/08 | 6.198 | 12.427 |
| 8/29/08 | 6.204 | 12.425 |
| 9/2/08 | 6.166 | 12.533 |
| 9/3/08 | 6.12 | 12.565 |
| 9/4/08 | 6.099 | 12.604 |
| 9/5/08 | 6.089 | 12.636 |
| 9/8/08 | 6.154 | 12.472 |
| 9/9/08 | 6.137 | 12.539 |
| 9/10/08 | 6.228 | 12.71 |
| 9/11/08 | 6.321 | 12.588 |
| 9/12/08 | 6.419 | 12.403 |
| 9/15/08 | 6.708 | 12.867 |
| 9/16/08 | 6.954 | 13.302 |
| 9/17/08 | 7.433 | 13.603 |
| 9/18/08 | 7.788 | 13.825 |
| 9/19/08 | 7.271 | 13.288 |
| 9/22/08 | 7.258 | 13.485 |
| 9/23/08 | 7.429 | 13.856 |
| 9/24/08 | 7.477 | 14.136 |
| 9/25/08 | 7.635 | 14.589 |
| 9/26/08 | 7.964 | 15.023 |
| 9/29/08 | 7.955 | 15.527 |
| 9/30/08 | 8.019 | 15.767 |
| 10/1/08 | 8.074 | 16.686 |
| 10/2/08 | 8.049 | 17.719 |
| 10/3/08 | 7.984 | 17.8 |
| 10/6/08 | 8.156 | 18.617 |
| 10/7/08 | 8.227 | 18.735 |
| 10/8/08 | 8.561 | 19.539 |
| 10/9/08 | 8.866 | 20.344 |
| 10/10/08 | 9.539 | 22.016 |
| 10/13/08 | 9.116 | 22.045 |
| 10/14/08 | 8.578 | 20.619 |
| 10/15/08 | 8.688 | 21.412 |
| 10/16/08 | 8.775 | 22.119 |
| 10/17/08 | 8.806 | 22.132 |
| 10/20/08 | 8.73 | 21.159 |
| 10/21/08 | 8.55 | 20.873 |
| 10/22/08 | 8.488 | 20.964 |
| 10/23/08 | 8.499 | 21.134 |
| 10/24/08 | 8.642 | 21.781 |
| 10/27/08 | 8.653 | 21.861 |
| 10/28/08 | 8.68 | 21.292 |
| 10/29/08 | 8.641 | 20.173 |
| 10/30/08 | 8.581 | 19.465 |
| 10/31/08 | 8.488 | 19.961 |
| 11/3/08 | 8.396 | 19.309 |
| 11/4/08 | 8.164 | 18.985 |
| 11/5/08 | 7.936 | 19.027 |
| 11/6/08 | 7.919 | 19.263 |
| 11/7/08 | 7.93 | 19.407 |
| 11/10/08 | 7.844 | 19.728 |
| 11/11/08 | 7.778 | 19.866 |
| 11/12/08 | 7.834 | 20.422 |
| 11/13/08 | 7.868 | 20.676 |
| 11/14/08 | 7.848 | 20.915 |
| 11/17/08 | 7.909 | 21.271 |
| 11/18/08 | 7.877 | 21.936 |
| 11/19/08 | 7.91 | 23.082 |
| 11/20/08 | 8.003 | 23.995 |
| 11/21/08 | 8.202 | 25.009 |
| 11/24/08 | 8.216 | 24.976 |
| 11/25/08 | 8.062 | 24.395 |
| 11/26/08 | 7.958 | 23.946 |
| 11/28/08 | 7.907 | 23.856 |
| 12/1/08 | 7.782 | 23.224 |
| 12/2/08 | 7.776 | 22.938 |
| 12/3/08 | 7.688 | 22.697 |
| 12/4/08 | 7.645 | 22.787 |
| 12/5/08 | 7.626 | 23.186 |
| 12/8/08 | 7.645 | 22.731 |
| 12/9/08 | 7.579 | 22.54 |
| 12/10/08 | 7.507 | 22.73 |
| 12/11/08 | 7.445 | 23.133 |
| 12/12/08 | 7.439 | 23.362 |
| 12/15/08 | 7.355 | 22.732 |
| 12/16/08 | 7.215 | 22.492 |
| 12/17/08 | 6.911 | 22.081 |
| 12/18/08 | 6.707 | 21.647 |
| 12/19/08 | 6.699 | 21.251 |
| 12/22/08 | 6.677 | 21.064 |
| 12/23/08 | 6.6 | 20.796 |
| 12/24/08 | 6.555 | 20.847 |
| 12/26/08 | 6.511 | 20.039 |
| 12/29/08 | 6.458 | 19.192 |
| 12/30/08 | 6.364 | 17.818 |
| 12/31/08 | 6.354 | 17.428 |
| 1/2/09 | 6.315 | 16.861 |
| 1/5/09 | 6.33 | 16.206 |
| 1/6/09 | 6.229 | 15.663 |
| 1/7/09 | 6.168 | 15.833 |
| 1/8/09 | 6.161 | 16.527 |
| 1/9/09 | 6.092 | 16.422 |
| 1/12/09 | 6.063 | 16.382 |
| 1/13/09 | 6.088 | 16.658 |
| 1/14/09 | 6.103 | 17.023 |
| 1/15/09 | 6.192 | 17.027 |
| 1/16/09 | 6.167 | 16.724 |
| 1/20/09 | 6.312 | 16.792 |
| 1/21/09 | 6.366 | 16.863 |
| 1/22/09 | 6.454 | 17.034 |
| 1/23/09 | 6.475 | 17.224 |
| 1/26/09 | 6.463 | 17.159 |
| 1/27/09 | 6.358 | 17.14 |
| 1/28/09 | 6.246 | 16.739 |
| 1/29/09 | 6.342 | 16.834 |
| 1/30/09 | 6.403 | 16.948 |
| 2/2/09 | 6.472 | 16.946 |
| 2/3/09 | 6.531 | 17.062 |
| 2/4/09 | 6.598 | 17.006 |
| 2/5/09 | 6.616 | 16.954 |
| 2/6/09 | 6.613 | 16.934 |
| 2/9/09 | 6.61 | 16.806 |
| 2/10/09 | 6.485 | 16.911 |
| 2/11/09 | 6.407 | 17.126 |
| 2/12/09 | 6.428 | 17.35 |
| 2/13/09 | 6.493 | 17.471 |
| 2/17/09 | 6.481 | 17.777 |
| 2/18/09 | 6.592 | 17.894 |
| 2/19/09 | 6.706 | 17.814 |
| 2/20/09 | 6.854 | 17.978 |
| 2/23/09 | 6.97 | 18.135 |
| 2/24/09 | 7.069 | 18.538 |
| 2/25/09 | 7.153 | 18.613 |
| 2/26/09 | 7.214 | 18.666 |
| 2/27/09 | 7.246 | 18.936 |
| 3/2/09 | 7.38 | 18.346 |
| 3/3/09 | 7.492 | 18.591 |
| 3/4/09 | 7.718 | 18.927 |
| 3/5/09 | 7.757 | 19.05 |
| 3/6/09 | 7.761 | 19.254 |
| 3/9/09 | 7.955 | 19.354 |
| 3/10/09 | 7.96 | 18.978 |
| 3/11/09 | 7.896 | 18.32 |
| 3/12/09 | 7.827 | 18.179 |
| 3/13/09 | 7.694 | 17.809 |
| 3/16/09 | 7.699 | 17.279 |
| 3/17/09 | 7.674 | 17.219 |
| 3/18/09 | 7.533 | 17.388 |
| 3/19/09 | 7.327 | 17.067 |
| 3/20/09 | 7.38 | 17.16 |
| 3/23/09 | 7.372 | 16.803 |
| 3/24/09 | 7.392 | 16.807 |
| 3/25/09 | 7.409 | 16.736 |
| 3/26/09 | 7.39 | 16.541 |
| 3/27/09 | 7.334 | 16.346 |
| 3/30/09 | 7.389 | 16.388 |
| 3/31/09 | 7.347 | 16.392 |
| 4/1/09 | 7.325 | 16.322 |
| 4/2/09 | 7.283 | 15.853 |
| 4/3/09 | 7.321 | 15.7 |
| 4/6/09 | 7.3 | 15.51 |
| 4/7/09 | 7.28 | 15.66 |
| 4/8/09 | 7.191 | 15.475 |
| 4/9/09 | 7.134 | 15.262 |
| 4/13/09 | 7.032 | 15.042 |
| 4/14/09 | 6.943 | 14.778 |
| 4/15/09 | 6.872 | 14.816 |
| 4/16/09 | 6.796 | 14.694 |
| 4/17/09 | 6.761 | 14.496 |
| 4/20/09 | 6.712 | 14.574 |
| 4/21/09 | 6.756 | 14.916 |
| 4/22/09 | 6.808 | 14.81 |
| 4/23/09 | 6.734 | 14.592 |
| 4/24/09 | 6.721 | 14.44 |
| 4/27/09 | 6.729 | 14.38 |
| 4/28/09 | 6.724 | 14.235 |
| 4/29/09 | 6.68 | 14.054 |
| 4/30/09 | 6.676 | 13.493 |
| 5/1/09 | 6.599 | 12.962 |
| 5/4/09 | 6.574 | 12.669 |
| 5/5/09 | 6.507 | 12.615 |
| 5/6/09 | 6.406 | 12.425 |
| 5/7/09 | 6.385 | 12.24 |
| 5/8/09 | 6.334 | 12.258 |
| 5/11/09 | 6.287 | 12.378 |
| 5/12/09 | 6.242 | 12.355 |
| 5/13/09 | 6.204 | 12.542 |
| 5/14/09 | 6.255 | 12.71 |
| 5/15/09 | 6.197 | 12.673 |
| 5/18/09 | 6.234 | 12.746 |
| 5/19/09 | 6.226 | 12.486 |
| 5/20/09 | 6.136 | 12.278 |
| 5/21/09 | 6.14 | 12.286 |
| 5/22/09 | 6.134 | 12.234 |
| 5/26/09 | 6.182 | 12.093 |
| 5/27/09 | 6.184 | 12.098 |
| 5/28/09 | 6.206 | 12.104 |
| 5/29/09 | 6.079 | 11.967 |
| 6/1/09 | 6.059 | 11.892 |
| 6/2/09 | 5.973 | 11.733 |
| 6/3/09 | 5.894 | 11.719 |
| 6/4/09 | 5.936 | 11.658 |
| 6/5/09 | 6.03 | 11.494 |
| 6/8/09 | 6.077 | 11.64 |
| 6/9/09 | 5.965 | 11.621 |
| 6/10/09 | 6.037 | 11.503 |
| 6/11/09 | 5.992 | 11.454 |
| 6/12/09 | 5.925 | 11.447 |
| 6/15/09 | 5.872 | 11.448 |
| 6/16/09 | 5.864 | 11.581 |
| 6/17/09 | 5.853 | 11.826 |
| 6/18/09 | 5.929 | 12.008 |
| 6/19/09 | 5.918 | 11.97 |
| 6/22/09 | 5.879 | 12.128 |
| 6/23/09 | 5.862 | 12.194 |
| 6/24/09 | 5.869 | 12.167 |
| 6/25/09 | 5.841 | 12.138 |
| 6/26/09 | 5.794 | 12.071 |
| 6/29/09 | 5.793 | 12.039 |
| 6/30/09 | 5.798 | 11.955 |
| 7/1/09 | 5.83 | 11.816 |
| 7/2/09 | 5.786 | 11.76 |
| 7/6/09 | 5.795 | 11.808 |
| 7/7/09 | 5.767 | 11.805 |
| 7/8/09 | 5.703 | 11.934 |
| 7/9/09 | 5.709 | 11.955 |
| 7/10/09 | 5.671 | 11.931 |
| 7/13/09 | 5.66 | 12.054 |
| 7/14/09 | 5.691 | 11.992 |
| 7/15/09 | 5.747 | 11.92 |
| 7/16/09 | 5.696 | 12.069 |
| 7/17/09 | 5.69 | 11.92 |
| 7/20/09 | 5.647 | 11.712 |
| 7/21/09 | 5.538 | 11.654 |
| 7/22/09 | 5.536 | 11.651 |
| 7/23/09 | 5.591 | 11.468 |
| 7/24/09 | 5.599 | 11.352 |
| 7/27/09 | 5.607 | 11.191 |
| 7/28/09 | 5.564 | 11.179 |
| 7/29/09 | 5.524 | 11.075 |
| 7/30/09 | 5.467 | 11.006 |
| 7/31/09 | 5.368 | 10.917 |
| 8/3/09 | 5.429 | 10.958 |
| 8/4/09 | 5.428 | 10.906 |
| 8/5/09 | 5.401 | 10.893 |
| 8/6/09 | 5.4 | 10.534 |
| 8/7/09 | 5.437 | 10.739 |
| 8/10/09 | 5.401 | 10.674 |
| 8/11/09 | 5.367 | 10.78 |
| 8/12/09 | 5.399 | 10.894 |
| 8/13/09 | 5.345 | 10.905 |
| 8/14/09 | 5.296 | 10.972 |
| 8/17/09 | 5.308 | 11.106 |
| 8/18/09 | 5.307 | 11.147 |
| 8/19/09 | 5.301 | 11.205 |
| 8/20/09 | 5.298 | 11.176 |
| 8/21/09 | 5.33 | 11.182 |
| 8/24/09 | 5.304 | 11.142 |
| 8/25/09 | 5.267 | 11.115 |
| 8/26/09 | 5.236 | 11.108 |
| 8/27/09 | 5.245 | 11.081 |
| 8/28/09 | 5.235 | 10.997 |
| 8/31/09 | 5.213 | 11.021 |
| 9/1/09 | 5.232 | 11.02 |
| 9/2/09 | 5.202 | 11.044 |
| 9/3/09 | 5.191 | 11.06 |
| 9/4/09 | 5.202 | 11.006 |
| 9/8/09 | 5.234 | 10.985 |
| 9/9/09 | 5.235 | 10.91 |
| 9/10/09 | 5.149 | 10.78 |
| 9/11/09 | 5.07 | 10.585 |
| 9/14/09 | 5.11 | 10.385 |
| 9/15/09 | 5.1 | 10.217 |
| 9/16/09 | 5.078 | 10.066 |
| 9/17/09 | 5.067 | 10.122 |
| 9/18/09 | 5.072 | 10.062 |
| 9/21/09 | 5.091 | 10.07 |
| 9/22/09 | 5.085 | 9.951 |
| 9/23/09 | 5.07 | 9.857 |
| 9/24/09 | 5.035 | 10.037 |
| 9/25/09 | 5.05 | 10.083 |
| 9/28/09 | 5.034 | 10.061 |
| 9/29/09 | 5.042 | 10.055 |
| 9/30/09 | 5.055 | 10.171 |
| 10/1/09 | 5.082 | 10.052 |
| 10/2/09 | 5.076 | 10.162 |
| 10/5/09 | 5.066 | 10.066 |
| 10/6/09 | 5.068 | 10.013 |
| 10/7/09 | 5.038 | 10.066 |
| 10/8/09 | 5.036 | 10.034 |
| 10/9/09 | 5.138 | 10.037 |
| 10/12/09 | 5.151 | 10.026 |
| 10/13/09 | 5.103 | 10.048 |
| 10/14/09 | 5.128 | 10.001 |
| 10/15/09 | 5.163 | 10.022 |
| 10/16/09 | 5.154 | 9.972 |
| 10/19/09 | 5.141 | 9.925 |
| 10/20/09 | 5.071 | 9.858 |
| 10/21/09 | 5.099 | 9.94 |
| 10/22/09 | 5.09 | 9.946 |
| 10/23/09 | 5.114 | 9.99 |
| 10/26/09 | 5.147 | 9.916 |
| 10/27/09 | 5.107 | 10.08 |
| 10/28/09 | 5.067 | 10.155 |
| 10/29/09 | 5.11 | 10.095 |
| 10/30/09 | 5.056 | 9.99 |
| 11/2/09 | 5.078 | 9.82 |
| 11/3/09 | 5.113 | 9.854 |
| 11/4/09 | 5.136 | 9.849 |
| 11/5/09 | 5.135 | 9.81 |
| 11/6/09 | 5.108 | 9.824 |
| 11/9/09 | 5.091 | 9.805 |
| 11/10/09 | 5.068 | 9.772 |
| 11/11/09 | 5.102 | 9.748 |
| 11/12/09 | 5.071 | 9.754 |
| 11/13/09 | 5.054 | 9.753 |
| 11/16/09 | 5.001 | 9.765 |
| 11/17/09 | 4.975 | 9.778 |
| 11/18/09 | 4.97 | 9.788 |
| 11/19/09 | 4.957 | 9.76 |
| 11/20/09 | 4.972 | 9.793 |
| 11/23/09 | 4.994 | 9.79 |
| 11/24/09 | 4.962 | 9.811 |
| 11/25/09 | 4.96 | 9.734 |
| 11/27/09 | 4.963 | 9.684 |
| 11/30/09 | 4.915 | 9.786 |
| 12/1/09 | 4.939 | 10.073 |
| 12/2/09 | 4.94 | 10.065 |
| 12/3/09 | 4.967 | 10.023 |
| 12/4/09 | 5.032 | 10.01 |
| 12/7/09 | 4.992 | 9.922 |
| 12/8/09 | 4.947 | 9.904 |
| 12/9/09 | 4.94 | 9.872 |
| 12/10/09 | 4.958 | 9.853 |
| 12/11/09 | 4.989 | 9.846 |
| 12/14/09 | 4.963 | 9.768 |
| 12/15/09 | 4.982 | 9.73 |
| 12/16/09 | 4.971 | 9.699 |
| 12/17/09 | 4.919 | 9.682 |
| 12/18/09 | 4.909 | 9.682 |
| 12/21/09 | 4.982 | 9.649 |
| 12/22/09 | 5.034 | 9.64 |
| 12/23/09 | 5.032 | 9.648 |
| 12/24/09 | 5.058 | 9.621 |
| 12/28/09 | 5.112 | 9.617 |
| 12/29/09 | 5.106 | 9.629 |
| 12/30/09 | 5.07 | 9.575 |
| 12/31/09 | 5.105 | 9.548 |
| 1/4/10 | 4.999 | 9.369 |
| 1/5/10 | 4.915 | 9.304 |
| 1/6/10 | 4.922 | 9.169 |
| 1/7/10 | 4.901 | 9.047 |
| 1/8/10 | 4.898 | 9.058 |
| 1/11/10 | 4.889 | 9.014 |
| 1/12/10 | 4.849 | 8.983 |
| 1/13/10 | 4.867 | 8.998 |
| 1/14/10 | 4.871 | 9.02 |
| 1/15/10 | 4.832 | 9.091 |
| 1/19/10 | 4.881 | 9.112 |
| 1/20/10 | 4.852 | 9.144 |
| 1/21/10 | 4.825 | 9.212 |
| 1/22/10 | 4.854 | 9.354 |
| 1/25/10 | 4.879 | 9.444 |
| 1/26/10 | 4.876 | 9.444 |
| 1/27/10 | 4.892 | 9.447 |
| 1/28/10 | 4.912 | 9.438 |
| 1/29/10 | 4.911 | 9.441 |
| 2/1/10 | 4.898 | 9.258 |
| 2/2/10 | 4.887 | 9.234 |
| 2/3/10 | 4.905 | 9.182 |
| 2/4/10 | 4.894 | 9.243 |
| 2/5/10 | 4.893 | 9.376 |
| 2/8/10 | 4.912 | 9.483 |
| 2/9/10 | 4.939 | 9.516 |
| 2/10/10 | 4.971 | 9.639 |
| 2/11/10 | 5.039 | 9.675 |
| 2/12/10 | 4.988 | 9.653 |
| 2/16/10 | 4.997 | 9.725 |
| 2/17/10 | 4.998 | 9.538 |
| 2/18/10 | 5.011 | 9.459 |
| 2/19/10 | 5.022 | 9.382 |
| 2/22/10 | 5 | 9.304 |
| 2/23/10 | 4.958 | 9.367 |
| 2/24/10 | 4.935 | 9.339 |
| 2/25/10 | 4.92 | 9.38 |
| 2/26/10 | 4.868 | 9.358 |
| 3/1/10 | 4.871 | 9.182 |
| 3/2/10 | 4.868 | 9.1 |
| 3/3/10 | 4.852 | 9.072 |
| 3/4/10 | 4.843 | 9.086 |
| 3/5/10 | 4.878 | 9.023 |
| 3/8/10 | 4.885 | 8.941 |
| 3/9/10 | 4.872 | 8.914 |
| 3/10/10 | 4.891 | 8.842 |
| 3/11/10 | 4.893 | 8.854 |
| 3/12/10 | 4.861 | 8.844 |
| 3/15/10 | 4.852 | 8.855 |
| 3/16/10 | 4.828 | 8.822 |
| 3/17/10 | 4.8 | 8.781 |
| 3/18/10 | 4.799 | 8.748 |
| 3/19/10 | 4.808 | 8.733 |
| 3/22/10 | 4.815 | 8.778 |
| 3/23/10 | 4.809 | 8.757 |
| 3/24/10 | 4.894 | 8.699 |
| 3/25/10 | 4.937 | 8.722 |
| 3/26/10 | 4.928 | 8.701 |
| 3/29/10 | 4.919 | 8.691 |
| 3/30/10 | 4.908 | 8.658 |
| 3/31/10 | 4.877 | 8.678 |
| 4/1/10 | 4.914 | 8.523 |
| 4/5/10 | 4.983 | 8.504 |
| 4/6/10 | 4.988 | 8.531 |
| 4/7/10 | 4.95 | 8.513 |
| 4/8/10 | 4.942 | 8.525 |
| 4/9/10 | 4.93 | 8.482 |
| 4/12/10 | 4.884 | 8.459 |
| 4/13/10 | 4.857 | 8.414 |
| 4/14/10 | 4.843 | 8.332 |
| 4/15/10 | 4.829 | 8.282 |
| 4/16/10 | 4.795 | 8.274 |
| 4/19/10 | 4.827 | 8.295 |
| 4/20/10 | 4.828 | 8.274 |
| 4/21/10 | 4.8 | 8.241 |
| 4/22/10 | 4.802 | 8.303 |
| 4/23/10 | 4.852 | 8.252 |
| 4/26/10 | 4.868 | 8.194 |
| 4/27/10 | 4.82 | 8.211 |
| 4/28/10 | 4.838 | 8.267 |
| 4/29/10 | 4.826 | 8.192 |
| 4/30/10 | 4.754 | 8.225 |
| 5/3/10 | 4.831 | 8.182 |
| 5/4/10 | 4.808 | 8.233 |
| 5/5/10 | 4.814 | 8.404 |
| 5/6/10 | 4.863 | 8.601 |
| 5/7/10 | 4.939 | 8.865 |
| 5/10/10 | 4.906 | 8.687 |
| 5/11/10 | 4.915 | 8.722 |
| 5/12/10 | 4.924 | 8.609 |
| 5/13/10 | 4.885 | 8.536 |
| 5/14/10 | 4.846 | 8.618 |
| 5/17/10 | 4.86 | 8.642 |
| 5/18/10 | 4.84 | 8.689 |
| 5/19/10 | 4.848 | 8.817 |
| 5/20/10 | 4.862 | 9.024 |
| 5/21/10 | 4.898 | 9.108 |
| 5/24/10 | 4.886 | 9.066 |
| 5/25/10 | 4.956 | 9.198 |
| 5/26/10 | 4.962 | 9.128 |
| 5/27/10 | 5.008 | 9.046 |
| 5/28/10 | 4.962 | 8.975 |
| 6/1/10 | 4.985 | 9.11 |
| 6/2/10 | 5.007 | 9.12 |
| 6/3/10 | 4.998 | 9.067 |
| 6/4/10 | 4.934 | 9.086 |
| 6/7/10 | 4.943 | 9.145 |
| 6/8/10 | 4.961 | 9.251 |
| 6/9/10 | 4.962 | 9.245 |
| 6/10/10 | 5.018 | 9.225 |
| 6/11/10 | 5.016 | 9.29 |
| 6/14/10 | 5.015 | 9.235 |
| 6/15/10 | 5.01 | 9.184 |
| 6/16/10 | 4.997 | 9.102 |
| 6/17/10 | 4.929 | 9.019 |
| 6/18/10 | 4.921 | 8.943 |
| 6/21/10 | 4.912 | 8.814 |
| 6/22/10 | 4.884 | 8.838 |
| 6/23/10 | 4.85 | 8.844 |
| 6/24/10 | 4.857 | 8.898 |
| 6/25/10 | 4.859 | 8.889 |
| 6/28/10 | 4.812 | 8.913 |
| 6/29/10 | 4.792 | 8.964 |
| 6/30/10 | 4.765 | 8.929 |
| 7/1/10 | 4.749 | 9.058 |
| 7/2/10 | 4.751 | 9.06 |
| 7/6/10 | 4.744 | 8.97 |
| 7/7/10 | 4.747 | 9.049 |
| 7/8/10 | 4.738 | 8.984 |
| 7/9/10 | 4.742 | 8.945 |
| 7/12/10 | 4.745 | 8.874 |
| 7/13/10 | 4.732 | 8.787 |
| 7/14/10 | 4.726 | 8.762 |
| 7/15/10 | 4.643 | 8.764 |
| 7/16/10 | 4.608 | 8.74 |
| 7/19/10 | 4.623 | 8.743 |
| 7/20/10 | 4.602 | 8.709 |
| 7/21/10 | 4.588 | 8.733 |
| 7/22/10 | 4.579 | 8.613 |
| 7/23/10 | 4.582 | 8.602 |
| 7/26/10 | 4.589 | 8.552 |
| 7/27/10 | 4.575 | 8.506 |
| 7/28/10 | 4.574 | 8.454 |
| 7/29/10 | 4.534 | 8.491 |
| 7/30/10 | 4.477 | 8.443 |
| 8/2/10 | 4.504 | 8.321 |
| 8/3/10 | 4.467 | 8.278 |
| 8/4/10 | 4.484 | 8.304 |
| 8/5/10 | 4.473 | 8.293 |
| 8/6/10 | 4.44 | 8.299 |
| 8/9/10 | 4.454 | 8.318 |
| 8/10/10 | 4.44 | 8.314 |
| 8/11/10 | 4.421 | 8.374 |
| 8/12/10 | 4.432 | 8.464 |
| 8/13/10 | 4.416 | 8.47 |
| 8/16/10 | 4.335 | 8.467 |
| 8/17/10 | 4.344 | 8.442 |
| 8/18/10 | 4.332 | 8.461 |
| 8/19/10 | 4.31 | 8.454 |
| 8/20/10 | 4.329 | 8.479 |
| 8/23/10 | 4.349 | 8.472 |
| 8/24/10 | 4.305 | 8.515 |
| 8/25/10 | 4.309 | 8.491 |
| 8/26/10 | 4.325 | 8.543 |
| 8/27/10 | 4.393 | 8.524 |
| 8/30/10 | 4.371 | 8.5 |
| 8/31/10 | 4.342 | 8.529 |
| 9/1/10 | 4.432 | 8.714 |
| 9/2/10 | 4.446 | 8.687 |
| 9/3/10 | 4.468 | 8.632 |
| 9/7/10 | 4.432 | 8.592 |
| 9/8/10 | 4.426 | 8.613 |
| 9/9/10 | 4.476 | 8.584 |
| 9/10/10 | 4.51 | 8.5 |
| 9/13/10 | 4.474 | 8.464 |
| 9/14/10 | 4.423 | 8.499 |
| 9/15/10 | 4.426 | 8.457 |
| 9/16/10 | 4.456 | 8.38 |
| 9/17/10 | 4.449 | 8.4 |
| 9/20/10 | 4.432 | 8.328 |
| 9/21/10 | 4.401 | 8.294 |
| 9/22/10 | 4.349 | 8.309 |
| 9/23/10 | 4.339 | 8.327 |
| 9/24/10 | 4.376 | 8.318 |
| 9/27/10 | 4.332 | 8.248 |
| 9/28/10 | 4.323 | 8.271 |
| 9/29/10 | 4.314 | 8.214 |
| 9/30/10 | 4.314 | 8.164 |
| 10/1/10 | 4.294 | 8.189 |
| 10/4/10 | 4.301 | 8.149 |
| 10/5/10 | 4.278 | 8.084 |
| 10/6/10 | 4.2 | 8.041 |
| 10/7/10 | 4.192 | 8 |
| 10/8/10 | 4.171 | 7.982 |
| 10/11/10 | 4.197 | 7.961 |
| 10/12/10 | 4.208 | 7.936 |
| 10/13/10 | 4.232 | 7.914 |
| 10/14/10 | 4.294 | 7.911 |
| 10/15/10 | 4.341 | 7.938 |
| 10/18/10 | 4.312 | 7.905 |
| 10/19/10 | 4.287 | 7.938 |
| 10/20/10 | 4.287 | 7.959 |
| 10/21/10 | 4.298 | 7.945 |
| 10/22/10 | 4.301 | 7.951 |
| 10/25/10 | 4.271 | 7.898 |
| 10/26/10 | 4.326 | 7.816 |
| 10/27/10 | 4.362 | 7.843 |
| 10/28/10 | 4.348 | 7.844 |
| 10/29/10 | 4.367 | 7.853 |
| 11/1/10 | 4.41 | 7.906 |
| 11/2/10 | 4.372 | 7.909 |
| 11/3/10 | 4.352 | 7.851 |
| 11/4/10 | 4.313 | 7.812 |
| 11/5/10 | 4.348 | 7.819 |
| 11/8/10 | 4.366 | 7.782 |
| 11/9/10 | 4.411 | 7.825 |
| 11/10/10 | 4.505 | 7.954 |
| 11/11/10 | 4.497 | 7.956 |
| 11/12/10 | 4.524 | 8.056 |
| 11/15/10 | 4.605 | 8.073 |
| 11/16/10 | 4.631 | 8.181 |
| 11/17/10 | 4.596 | 8.253 |
| 11/18/10 | 4.637 | 8.124 |
| 11/19/10 | 4.608 | 8.178 |
| 11/22/10 | 4.582 | 8.201 |
| 11/23/10 | 4.557 | 8.656 |
| 11/24/10 | 4.645 | 8.606 |
| 11/26/10 | 4.636 | 8.437 |
| 11/29/10 | 4.63 | 8.235 |
| 11/30/10 | 4.615 | 8.237 |
| 12/1/10 | 4.674 | 8.34 |
| 12/2/10 | 4.685 | 8.285 |
| 12/3/10 | 4.677 | 8.227 |
| 12/6/10 | 4.64 | 8.229 |
| 12/7/10 | 4.709 | 8.208 |
| 12/8/10 | 4.799 | 8.279 |
| 12/9/10 | 4.78 | 8.261 |
| 12/10/10 | 4.795 | 8.312 |
| 12/13/10 | 4.808 | 8.292 |
| 12/14/10 | 4.858 | 8.31 |
| 12/15/10 | 4.919 | 8.361 |
| 12/16/10 | 4.915 | 8.376 |
| 12/17/10 | 4.864 | 8.387 |
| 12/20/10 | 4.795 | 8.378 |
| 12/21/10 | 4.813 | 8.392 |
| 12/22/10 | 4.8 | 8.41 |
| 12/23/10 | 4.826 | 8.364 |
| 12/27/10 | 4.857 | 8.361 |
| 12/28/10 | 4.876 | 8.299 |
| 12/29/10 | 4.839 | 8.346 |
| 12/30/10 | 4.81 | 8.33 |
| 12/31/10 | 4.776 | 8.325 |